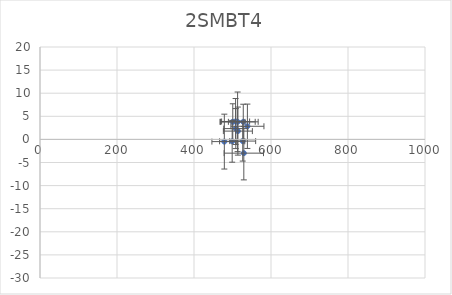
| Category | 2SMBT4 |
|---|---|
| 478.774584317189 | -0.476 |
| 499.1488967999618 | -0.412 |
| 500.71099982510947 | 3.803 |
| 513.2486373040749 | 3.805 |
| 538.7166639431919 | 2.842 |
| 526.5435141989294 | -0.365 |
| 513.9717721333486 | 1.798 |
| 508.07021459506257 | 3.876 |
| 528.0007099569244 | 3.807 |
| 529.387381299461 | -2.976 |
| 508.54663641473275 | 2.336 |